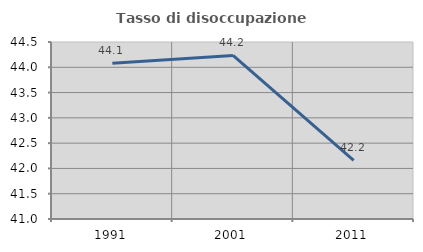
| Category | Tasso di disoccupazione giovanile  |
|---|---|
| 1991.0 | 44.079 |
| 2001.0 | 44.234 |
| 2011.0 | 42.159 |